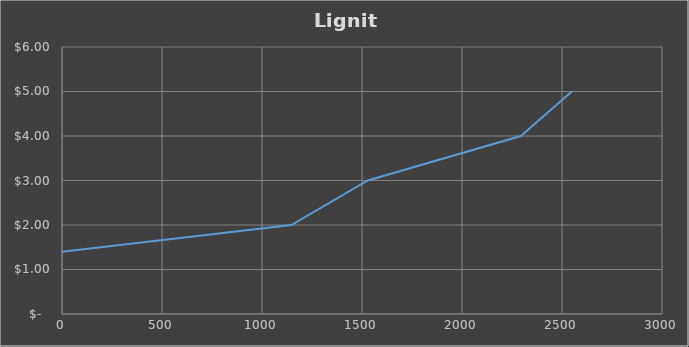
| Category | Series 0 |
|---|---|
| 0.0 | 1.4 |
| 1146.75 | 2 |
| 1529.0 | 3 |
| 2294.0 | 4 |
| 2549.0 | 5 |